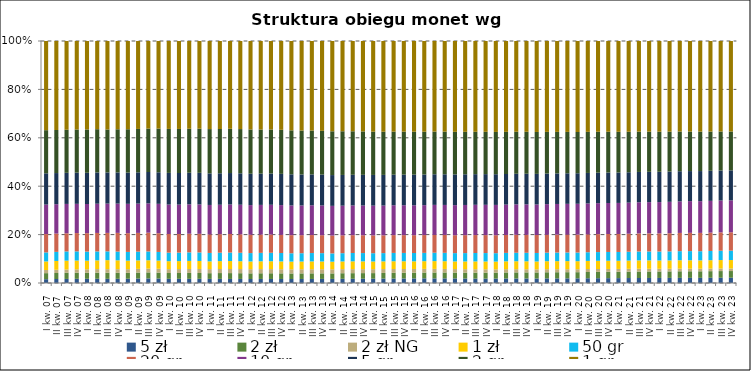
| Category | 5 zł | 2 zł | 2 zł NG | 1 zł | 50 gr | 20 gr | 10 gr | 5 gr | 2 gr | 1 gr |
|---|---|---|---|---|---|---|---|---|---|---|
| I kw. 07 | 128.925 | 203.436 | 106.455 | 288.697 | 303.986 | 617.921 | 995.443 | 1054.495 | 1455.279 | 3008.076 |
| II kw. 07 | 137.979 | 208.811 | 112.669 | 304.354 | 314.953 | 632.421 | 1017.821 | 1079.458 | 1491.694 | 3082.289 |
| III kw. 07 | 144.925 | 218.512 | 117.189 | 314.387 | 327.785 | 644.381 | 1045.808 | 1106.071 | 1532.131 | 3157.015 |
| IV kw. 07 | 152.966 | 222.148 | 124.747 | 320.172 | 334.976 | 668.63 | 1068.443 | 1138.454 | 1577.09 | 3233.525 |
| I kw. 08 | 157.034 | 223.38 | 132.378 | 322.573 | 338.209 | 688.09 | 1090.962 | 1166.176 | 1619.841 | 3305.89 |
| II kw. 08 | 162.349 | 231.933 | 137.587 | 333.21 | 342.406 | 707.859 | 1117.7 | 1197.903 | 1653.619 | 3374.339 |
| III kw. 08 | 163.389 | 237.944 | 140.149 | 352.6 | 344.781 | 723.211 | 1146.852 | 1222.462 | 1679.878 | 3465.863 |
| IV kw. 08 | 167.692 | 239.632 | 145.228 | 354.438 | 349.388 | 748.138 | 1170.047 | 1248.882 | 1724.192 | 3529.936 |
| I kw. 09 | 173.376 | 238.946 | 148.941 | 345.802 | 354.387 | 760.651 | 1189.614 | 1266.928 | 1759.557 | 3580.576 |
| II kw. 09 | 183.943 | 247.689 | 153.277 | 349.818 | 361.813 | 775.375 | 1211.241 | 1294.127 | 1793.901 | 3636.416 |
| III kw. 09 | 193.254 | 255.113 | 159.526 | 352.836 | 371.531 | 795.289 | 1239.154 | 1325.485 | 1836.365 | 3700.936 |
| IV kw. 09 | 193.912 | 253.541 | 165.782 | 351.473 | 372.198 | 806.961 | 1263.964 | 1358.406 | 1881.651 | 3769.924 |
| I kw. 10 | 182.767 | 251.651 | 169.078 | 347.059 | 371.217 | 812.077 | 1281.063 | 1380.048 | 1915.753 | 3828.451 |
| II kw. 10 | 185.525 | 256.719 | 173.377 | 351.98 | 374.793 | 821.085 | 1298.268 | 1398.335 | 1945.532 | 3884.836 |
| III kw. 10 | 188.842 | 264.995 | 179.083 | 362.819 | 385.456 | 840.415 | 1326.115 | 1423.291 | 1984.831 | 3956.495 |
| IV kw. 10 | 193.516 | 267.974 | 185.165 | 367.917 | 391.868 | 856.578 | 1354.582 | 1455.7 | 2032.021 | 4038.622 |
| I kw. 11 | 191.459 | 264.781 | 188.57 | 362.559 | 390.659 | 862.285 | 1367.95 | 1468.96 | 2058.911 | 4095.575 |
| II kw. 11 | 195.592 | 274.413 | 190.939 | 373.822 | 398.339 | 875.265 | 1391.669 | 1488.275 | 2093.662 | 4161.521 |
| III kw. 11 | 196.53 | 280.852 | 198.093 | 383.193 | 409.038 | 894.127 | 1424.242 | 1516.243 | 2134.375 | 4231.885 |
| IV kw. 11 | 200.335 | 282.076 | 203.984 | 386.198 | 415.495 | 907.751 | 1455.793 | 1546.269 | 2176.945 | 4334.419 |
| I kw. 12 | 200.546 | 279.966 | 207.48 | 385.483 | 417.148 | 914.198 | 1475.656 | 1561.095 | 2205.9 | 4406.36 |
| II kw. 12 | 205.869 | 287.613 | 211.679 | 396.374 | 427.04 | 927.83 | 1504.87 | 1585.087 | 2238.306 | 4490.048 |
| III kw. 12 | 208.879 | 295.2 | 215.161 | 406.923 | 438.065 | 946.562 | 1538.924 | 1617.227 | 2280.753 | 4581.353 |
| IV kw. 12 | 212.566 | 296.813 | 217.87 | 411.13 | 444.384 | 959.891 | 1568.443 | 1647.746 | 2323.575 | 4686.362 |
| I kw. 13 | 213.063 | 294.389 | 220.743 | 408.499 | 444.055 | 962.746 | 1578.435 | 1656.492 | 2337.449 | 4749.773 |
| II kw. 13 | 217.178 | 300.523 | 223.439 | 415.506 | 449.086 | 971.317 | 1599.532 | 1670.426 | 2368.486 | 4825.128 |
| III kw. 13 | 222.036 | 308.946 | 226.131 | 429.643 | 461.435 | 989.474 | 1636.183 | 1698.648 | 2410.775 | 4926.225 |
| IV kw. 13 | 229.505 | 311.774 | 230.296 | 435.098 | 468.399 | 1004.504 | 1670.697 | 1729.874 | 2455.202 | 5039.382 |
| I kw. 14 | 232.24 | 311.623 | 232.286 | 432.489 | 468.693 | 1011.378 | 1684.791 | 1745.822 | 2481.781 | 5119.349 |
| II kw. 14 | 242.402 | 321.521 | 234.94 | 443.67 | 477.189 | 1027.701 | 1711.629 | 1772.309 | 2518.693 | 5206.301 |
| III kw. 14 | 248.403 | 329.786 | 235.973 | 457.954 | 490.528 | 1047.361 | 1746.557 | 1802.208 | 2555.805 | 5305.533 |
| IV kw. 14 | 256.156 | 335.691 | 236.99 | 464.377 | 498.228 | 1064.886 | 1780.762 | 1835.565 | 2596.666 | 5411.291 |
| I kw. 15 | 259.795 | 339.199 | 237.751 | 465.29 | 501.73 | 1076.038 | 1801.716 | 1858.024 | 2617.574 | 5487.856 |
| II kw. 15 | 269.561 | 347.809 | 238.127 | 472.173 | 507.863 | 1089.703 | 1829.063 | 1882.038 | 2649.616 | 5570.77 |
| III kw. 15 | 276.319 | 359.906 | 238.068 | 484.916 | 521.917 | 1112.486 | 1866.802 | 1910.586 | 2691.438 | 5668.586 |
| IV kw. 15 | 287.191 | 366.776 | 238.395 | 491.303 | 531.108 | 1134.293 | 1902.082 | 1949.474 | 2737.229 | 5774.219 |
| I kw. 16 | 294.192 | 369.006 | 238.61 | 491.608 | 534.269 | 1144.438 | 1921.446 | 1971.102 | 2760.234 | 5832.671 |
| II kw. 16 | 304.708 | 378.074 | 238.83 | 501.236 | 542.469 | 1161.703 | 1950.395 | 1997.299 | 2793.418 | 5918.568 |
| III kw. 16 | 307.171 | 391.82 | 239.079 | 517.008 | 558.453 | 1188.77 | 1993.787 | 2035.926 | 2838.051 | 6025.42 |
| IV kw. 16 | 314.109 | 398.15 | 239.14 | 523.139 | 567.171 | 1210.091 | 2031.478 | 2073.818 | 2886.045 | 6134.696 |
| I kw. 17 | 315.02 | 396.81 | 239.231 | 520.22 | 567.926 | 1219.441 | 2052.53 | 2093.323 | 2905.215 | 6196.261 |
| II kw. 17 | 309.993 | 407.715 | 239.249 | 534.015 | 579.307 | 1238.966 | 2088.988 | 2122.103 | 2938.075 | 6283.488 |
| III kw. 17 | 308.889 | 420.928 | 239.278 | 549.291 | 592.929 | 1262.511 | 2130.026 | 2156.115 | 2982.066 | 6389.334 |
| IV kw. 17 | 314.474 | 428.391 | 239.267 | 559.553 | 604.371 | 1286.151 | 2170.29 | 2198.663 | 3031.34 | 6506.583 |
| I kw. 18 | 319.046 | 430.374 | 239.252 | 560.732 | 608.532 | 1297.682 | 2193.416 | 2220.164 | 3059.788 | 6578.072 |
| II kw. 18 | 329.901 | 442.987 | 239.239 | 576.505 | 620.494 | 1315.919 | 2224.435 | 2246.274 | 3089.841 | 6663.638 |
| III kw. 18 | 334.237 | 455.729 | 239.17 | 593.359 | 635.826 | 1340.588 | 2268.012 | 2282.518 | 3135.208 | 6771.373 |
| IV kw. 18 | 341.881 | 462.828 | 239.125 | 604.507 | 648.726 | 1364.466 | 2311.738 | 2325.022 | 3188.515 | 6895.9 |
| I kw. 19 | 345.442 | 461.095 | 239.095 | 601.763 | 650.858 | 1373.241 | 2334.996 | 2341.851 | 3208.288 | 6959.509 |
| II kw. 19 | 358.548 | 474.879 | 239.106 | 621.047 | 664.963 | 1392.1 | 2375.63 | 2375.481 | 3239.7 | 7061.23 |
| III kw. 19 | 364.082 | 485.014 | 239.111 | 635.493 | 678.835 | 1413.236 | 2419.742 | 2411.099 | 3275.48 | 7170.917 |
| IV kw. 19 | 373.126 | 494.375 | 239.095 | 649.039 | 692.514 | 1435.008 | 2466.395 | 2451.652 | 3319.038 | 7292.268 |
| I kw. 20 | 377.249 | 495.484 | 239.058 | 649.067 | 697.46 | 1444.718 | 2490.679 | 2464.705 | 3329.683 | 7343.939 |
| II kw. 20 | 386.996 | 510.138 | 239.054 | 663.223 | 707.112 | 1457.351 | 2516.581 | 2483.394 | 3346.22 | 7401.258 |
| III kw. 20 | 396.597 | 521.097 | 239.025 | 676.534 | 721.048 | 1480.446 | 2558.517 | 2516.602 | 3378.328 | 7495.087 |
| IV kw. 20 | 405.58 | 530.727 | 239.001 | 686.043 | 734.132 | 1501.394 | 2595.004 | 2547.8 | 3409.065 | 7588.717 |
| I kw. 21 | 411.068 | 534.506 | 238.988 | 686.622 | 739.64 | 1511.953 | 2613.255 | 2560.543 | 3421.066 | 7639.865 |
| II kw. 21 | 422.016 | 545.514 | 238.989 | 697.802 | 750.342 | 1528.042 | 2640.382 | 2580.153 | 3438.675 | 7708.049 |
| III kw. 21 | 430.315 | 557.996 | 238.981 | 713.487 | 764.738 | 1551.155 | 2678.092 | 2604.938 | 3460.404 | 7787.601 |
| IV kw. 21 | 438.749 | 565.282 | 238.98 | 723.141 | 777.453 | 1574.071 | 2717.358 | 2637.317 | 3490.741 | 7887.254 |
| I kw. 22 | 442.683 | 567.923 | 238.979 | 722.905 | 784.732 | 1587.817 | 2743.238 | 2653.281 | 3508.544 | 7944.894 |
| II kw. 22 | 451.667 | 577.97 | 238.964 | 731.655 | 798.681 | 1609.796 | 2781.321 | 2679.677 | 3532.465 | 8029.16 |
| III kw. 22 | 458.214 | 592.07 | 238.94 | 747.689 | 815.85 | 1633.936 | 2826.283 | 2703.616 | 3555.716 | 8113.337 |
| IV kw. 22 | 464.603 | 598.31 | 238.939 | 755.455 | 830.167 | 1657.44 | 2869.904 | 2722.977 | 3576.48 | 8204.527 |
| I kw. 23 | 467.23 | 599.346 | 238.931 | 755.565 | 835.697 | 1667.785 | 2889.033 | 2743.369 | 3591.206 | 8255.328 |
| II kw. 23 | 477.758 | 610.765 | 238.933 | 768.438 | 849.733 | 1684.979 | 2921.469 | 2762.687 | 3606.268 | 8325.731 |
| III kw. 23 | 484.89 | 622.721 | 238.908 | 784.169 | 865.779 | 1705.047 | 2958.271 | 2788.993 | 3623.511 | 8403.872 |
| IV kw. 23 | 493.292 | 630.243 | 238.902 | 794.723 | 880.309 | 1726.536 | 2997.739 | 2820.365 | 3648.018 | 8504.643 |